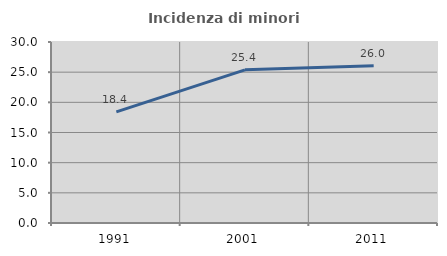
| Category | Incidenza di minori stranieri |
|---|---|
| 1991.0 | 18.421 |
| 2001.0 | 25.385 |
| 2011.0 | 26.047 |